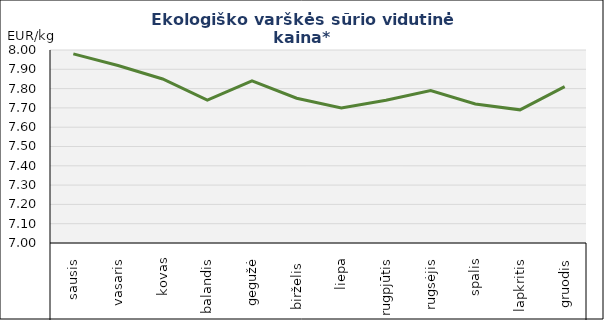
| Category | Varškės sūris |
|---|---|
| 0 | 7.98 |
| 1 | 7.92 |
| 2 | 7.85 |
| 3 | 7.74 |
| 4 | 7.84 |
| 5 | 7.75 |
| 6 | 7.7 |
| 7 | 7.74 |
| 8 | 7.79 |
| 9 | 7.72 |
| 10 | 7.69 |
| 11 | 7.81 |